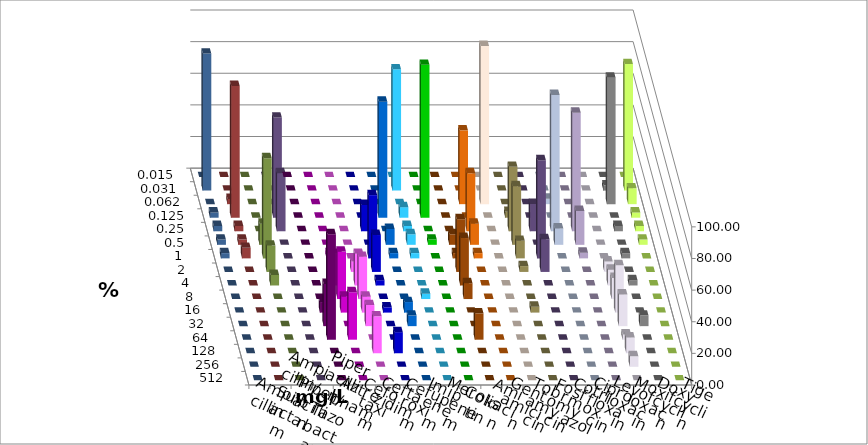
| Category | Ampicillin | Ampicillin/ Sulbactam | Piperacillin | Piperacillin/ Tazobactam | Aztreonam | Cefotaxim | Ceftazidim | Cefuroxim | Imipenem | Meropenem | Colistin | Amikacin | Gentamicin | Tobramycin | Fosfomycin | Cotrimoxazol | Ciprofloxacin | Levofloxacin | Moxifloxacin | Doxycyclin | Tigecyclin |
|---|---|---|---|---|---|---|---|---|---|---|---|---|---|---|---|---|---|---|---|---|---|
| 0.015 | 0 | 0 | 0 | 0 | 0 | 0 | 0 | 0 | 0 | 0 | 0 | 0 | 0 | 0 | 0 | 0 | 0 | 0 | 0 | 0 | 0 |
| 0.031 | 0 | 0 | 0 | 0 | 0 | 76.667 | 0 | 0 | 0 | 0 | 0 | 0 | 0 | 0 | 0 | 3.333 | 80 | 86.667 | 0 | 0 | 0 |
| 0.062 | 0 | 0 | 0 | 0 | 0 | 0 | 0 | 0 | 46.667 | 100 | 0 | 0 | 3.448 | 0 | 0 | 80 | 10 | 0 | 3.333 | 0 | 0 |
| 0.125 | 0 | 0 | 0 | 0 | 73.333 | 6.667 | 96.667 | 0 | 0 | 0 | 3.704 | 0 | 0 | 0 | 0 | 0 | 3.333 | 3.333 | 83.333 | 0 | 63.333 |
| 0.25 | 0 | 0 | 0 | 16.667 | 0 | 3.333 | 0 | 0 | 36.667 | 0 | 40.741 | 17.241 | 86.207 | 75 | 0 | 3.333 | 3.333 | 3.333 | 3.333 | 0 | 36.667 |
| 0.5 | 0 | 0 | 0 | 0 | 10 | 6.667 | 3.333 | 6.667 | 13.333 | 0 | 37.037 | 0 | 10.345 | 21.429 | 0 | 0 | 3.333 | 3.333 | 3.333 | 13.333 | 0 |
| 1.0 | 0 | 3.333 | 0 | 40 | 3.333 | 3.333 | 0 | 3.333 | 3.333 | 0 | 11.111 | 62.069 | 0 | 3.571 | 0 | 3.333 | 0 | 3.333 | 6.667 | 63.333 | 0 |
| 2.0 | 0 | 6.667 | 6.667 | 23.333 | 0 | 0 | 0 | 33.333 | 0 | 0 | 3.704 | 20.69 | 0 | 0 | 6.667 | 0 | 0 | 0 | 0 | 16.667 | 0 |
| 4.0 | 0 | 20 | 20 | 3.333 | 0 | 0 | 0 | 30 | 0 | 0 | 0 | 0 | 0 | 0 | 10 | 3.333 | 0 | 0 | 0 | 6.667 | 0 |
| 8.0 | 0 | 30 | 26.667 | 0 | 0 | 3.333 | 0 | 10 | 0 | 0 | 0 | 0 | 0 | 0 | 13.333 | 0 | 0 | 0 | 0 | 0 | 0 |
| 16.0 | 6.667 | 10 | 10 | 3.333 | 6.667 | 0 | 0 | 0 | 0 | 0 | 3.704 | 0 | 0 | 0 | 30 | 0 | 0 | 0 | 0 | 0 | 0 |
| 32.0 | 26.667 | 0 | 13.333 | 0 | 6.667 | 0 | 0 | 0 | 0 | 0 | 0 | 0 | 0 | 0 | 20 | 6.667 | 0 | 0 | 0 | 0 | 0 |
| 64.0 | 66.667 | 30 | 0 | 0 | 0 | 0 | 0 | 16.667 | 0 | 0 | 0 | 0 | 0 | 0 | 3.333 | 0 | 0 | 0 | 0 | 0 | 0 |
| 128.0 | 0 | 0 | 23.333 | 13.333 | 0 | 0 | 0 | 0 | 0 | 0 | 0 | 0 | 0 | 0 | 10 | 0 | 0 | 0 | 0 | 0 | 0 |
| 256.0 | 0 | 0 | 0 | 0 | 0 | 0 | 0 | 0 | 0 | 0 | 0 | 0 | 0 | 0 | 6.667 | 0 | 0 | 0 | 0 | 0 | 0 |
| 512.0 | 0 | 0 | 0 | 0 | 0 | 0 | 0 | 0 | 0 | 0 | 0 | 0 | 0 | 0 | 0 | 0 | 0 | 0 | 0 | 0 | 0 |